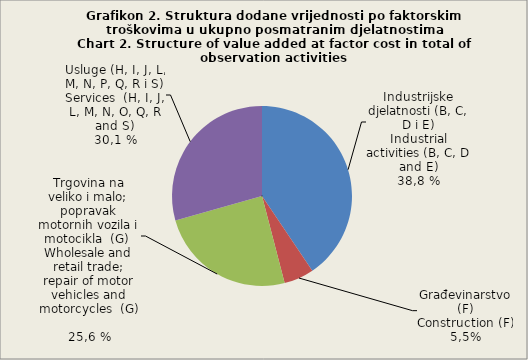
| Category | Dodana vrijednost po faktorskim troškovima
Value added at factor cost |
|---|---|
| Industrijske djelatnosti (B, C, D i E)
Industrial activities (B, C, D and E) | 40.6 |
| Građevinarstvo (F)
Construction (F) | 5.4 |
| Trgovina na veliko i malo; popravak motornih vozila i motocikla  (G) 
Wholesale and retail trade; repair of motor vehicles and motorcycles  (G)
 | 24.7 |
| Usluge (H, I i L)
Services (H, I and L) | 29.4 |